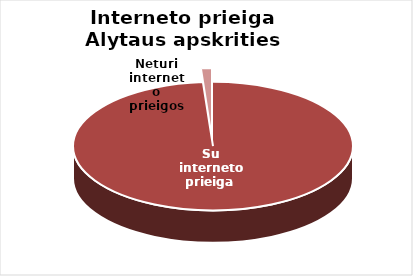
| Category | Series 0 |
|---|---|
| Su interneto prieiga  | 86 |
| Neturi interneto prieigos | 1 |